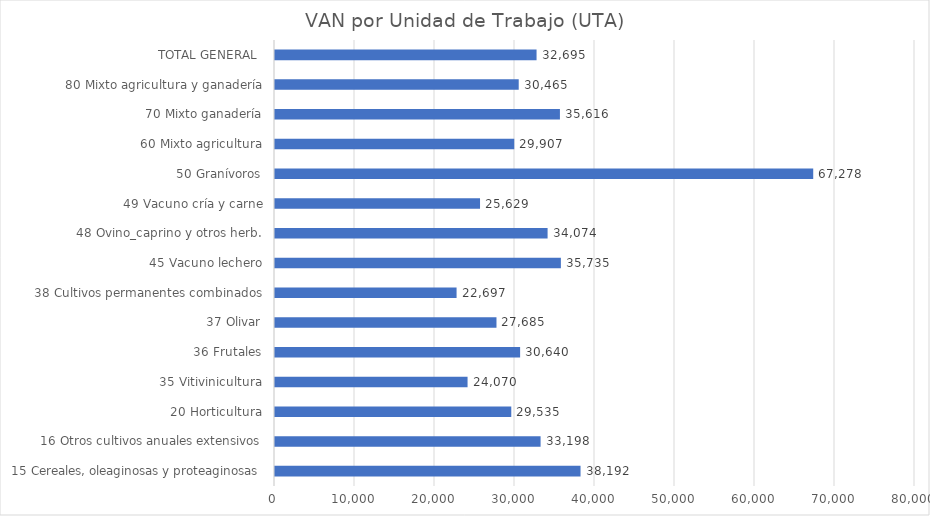
| Category | VAN por Unidad de Trabajo (UTA) |
|---|---|
| 15 Cereales, oleaginosas y proteaginosas | 38192 |
| 16 Otros cultivos anuales extensivos | 33198 |
| 20 Horticultura | 29535 |
| 35 Vitivinicultura | 24070 |
| 36 Frutales | 30640 |
| 37 Olivar | 27685 |
| 38 Cultivos permanentes combinados | 22697 |
| 45 Vacuno lechero | 35735 |
| 48 Ovino_caprino y otros herb. | 34074 |
| 49 Vacuno cría y carne | 25629 |
| 50 Granívoros | 67278 |
| 60 Mixto agricultura | 29907 |
| 70 Mixto ganadería | 35616 |
| 80 Mixto agricultura y ganadería | 30465 |
| TOTAL GENERAL  | 32695 |